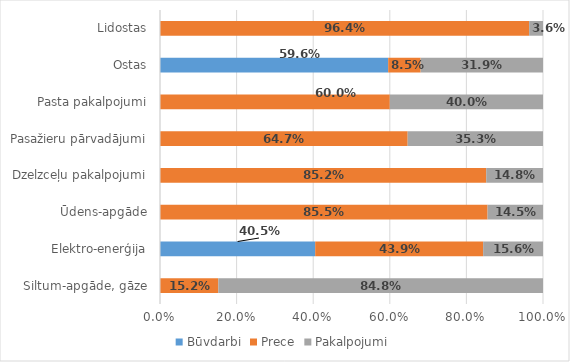
| Category | Būvdarbi | Prece | Pakalpojumi |
|---|---|---|---|
| Siltum-apgāde, gāze | 0 | 0.152 | 0.848 |
| Elektro-enerģija | 0.405 | 0.439 | 0.156 |
| Ūdens-apgāde | 0 | 0.855 | 0.145 |
| Dzelzceļu pakalpojumi | 0 | 0.852 | 0.148 |
| Pasažieru pārvadājumi | 0 | 0.647 | 0.353 |
| Pasta pakalpojumi | 0 | 0.6 | 0.4 |
| Ostas | 0.596 | 0.085 | 0.319 |
| Lidostas | 0 | 0.964 | 0.036 |